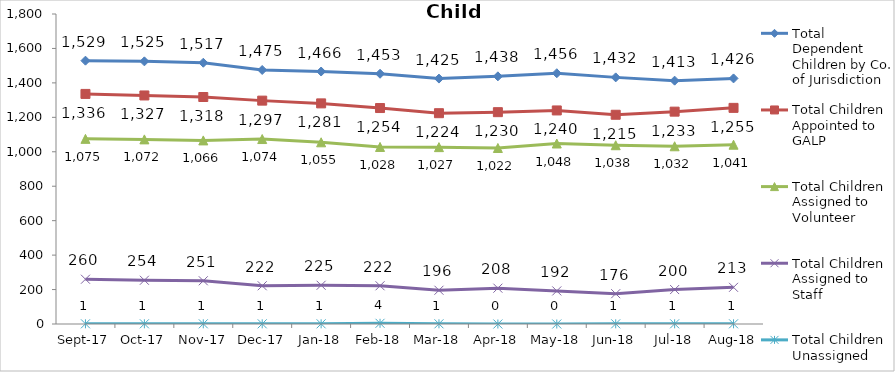
| Category | Total Dependent Children by Co. of Jurisdiction | Total Children Appointed to GALP | Total Children Assigned to Volunteer | Total Children Assigned to Staff | Total Children Unassigned |
|---|---|---|---|---|---|
| 2017-09-01 | 1529 | 1336 | 1075 | 260 | 1 |
| 2017-10-01 | 1525 | 1327 | 1072 | 254 | 1 |
| 2017-11-01 | 1517 | 1318 | 1066 | 251 | 1 |
| 2017-12-01 | 1475 | 1297 | 1074 | 222 | 1 |
| 2018-01-01 | 1466 | 1281 | 1055 | 225 | 1 |
| 2018-02-01 | 1453 | 1254 | 1028 | 222 | 4 |
| 2018-03-01 | 1425 | 1224 | 1027 | 196 | 1 |
| 2018-04-01 | 1438 | 1230 | 1022 | 208 | 0 |
| 2018-05-01 | 1456 | 1240 | 1048 | 192 | 0 |
| 2018-06-01 | 1432 | 1215 | 1038 | 176 | 1 |
| 2018-07-01 | 1413 | 1233 | 1032 | 200 | 1 |
| 2018-08-01 | 1426 | 1255 | 1041 | 213 | 1 |